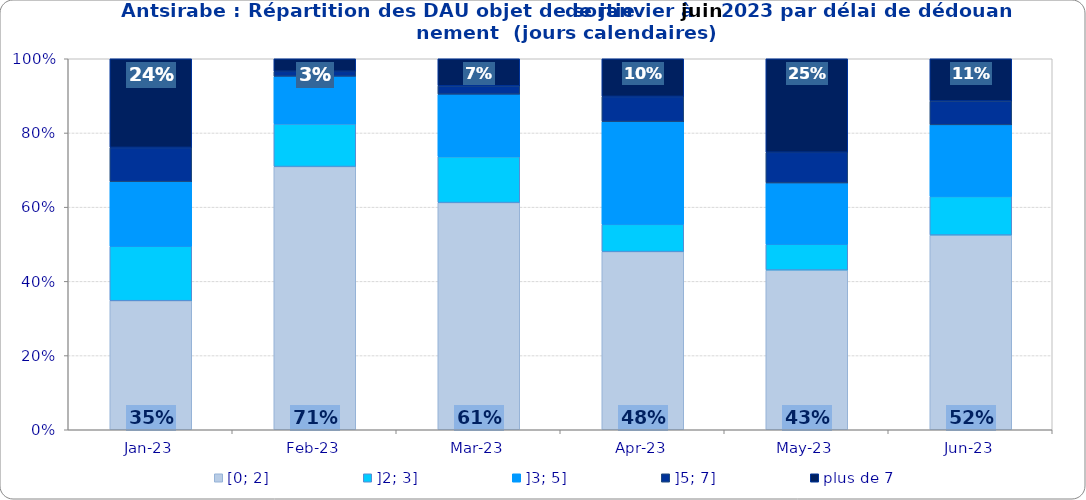
| Category | [0; 2] | ]2; 3] | ]3; 5] | ]5; 7] | plus de 7 |
|---|---|---|---|---|---|
| 2023-01-01 | 0.348 | 0.147 | 0.174 | 0.092 | 0.239 |
| 2023-02-01 | 0.709 | 0.115 | 0.128 | 0.014 | 0.034 |
| 2023-03-01 | 0.612 | 0.124 | 0.169 | 0.022 | 0.073 |
| 2023-04-01 | 0.48 | 0.073 | 0.277 | 0.068 | 0.102 |
| 2023-05-01 | 0.43 | 0.07 | 0.165 | 0.083 | 0.252 |
| 2023-06-01 | 0.525 | 0.104 | 0.193 | 0.064 | 0.114 |